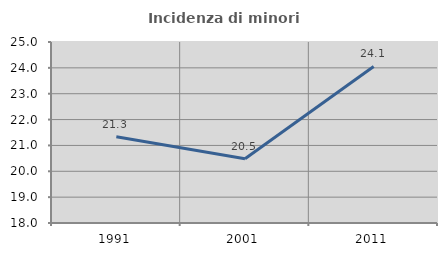
| Category | Incidenza di minori stranieri |
|---|---|
| 1991.0 | 21.333 |
| 2001.0 | 20.485 |
| 2011.0 | 24.055 |